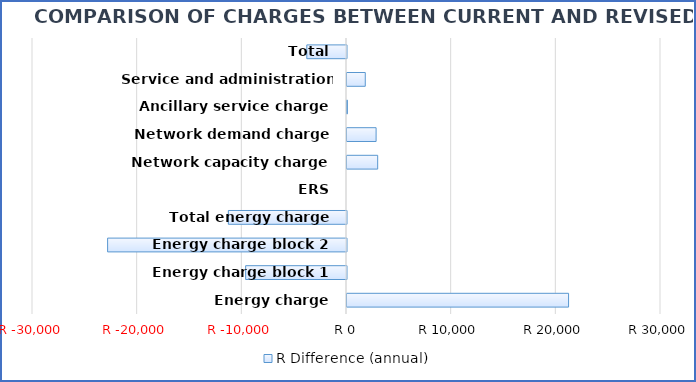
| Category | R Difference (annual) |
|---|---|
| Energy charge | 21169.8 |
| Energy charge block 1 | -9635.76 |
| Energy charge block 2 | -22822.56 |
| Total energy charge | -11288.52 |
| ERS | 0 |
| Network capacity charge | 2931.66 |
| Network demand charge | 2781 |
| Ancillary service charge | 39.348 |
| Service and administration charge | 1745.82 |
| Total | -3790.692 |